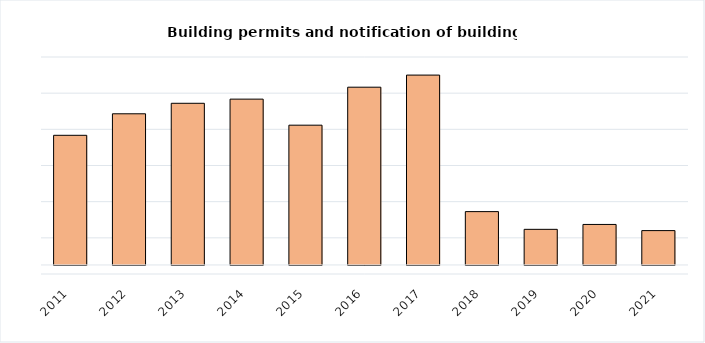
| Category | Building permits and notification of building work |
|---|---|
| 2011.0 | 717 |
| 2012.0 | 836 |
| 2013.0 | 894 |
| 2014.0 | 917 |
| 2015.0 | 773 |
| 2016.0 | 983 |
| 2017.0 | 1050 |
| 2018.0 | 295 |
| 2019.0 | 197 |
| 2020.0 | 224 |
| 2021.0 | 190 |